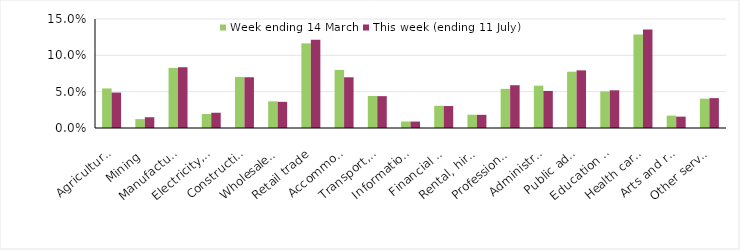
| Category | Week ending 14 March | This week (ending 11 July) |
|---|---|---|
| Agriculture, forestry and fishing | 0.054 | 0.049 |
| Mining | 0.012 | 0.015 |
| Manufacturing | 0.083 | 0.084 |
| Electricity, gas, water and waste services | 0.019 | 0.021 |
| Construction | 0.07 | 0.07 |
| Wholesale trade | 0.037 | 0.036 |
| Retail trade | 0.116 | 0.121 |
| Accommodation and food services | 0.08 | 0.07 |
| Transport, postal and warehousing | 0.044 | 0.044 |
| Information media and telecommunications | 0.009 | 0.009 |
| Financial and insurance services | 0.031 | 0.03 |
| Rental, hiring and real estate services | 0.018 | 0.018 |
| Professional, scientific and technical services | 0.054 | 0.059 |
| Administrative and support services | 0.058 | 0.051 |
| Public administration and safety | 0.077 | 0.079 |
| Education and training | 0.05 | 0.052 |
| Health care and social assistance | 0.129 | 0.136 |
| Arts and recreation services | 0.017 | 0.016 |
| Other services | 0.04 | 0.041 |